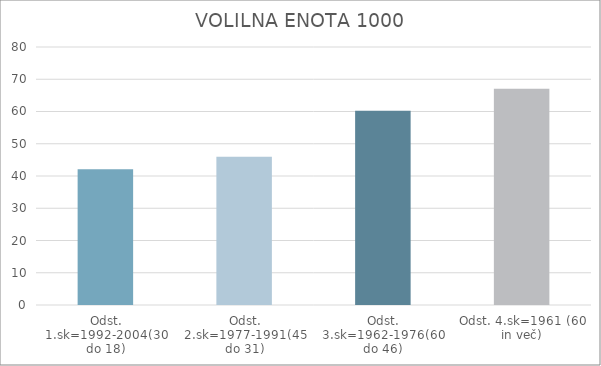
| Category | Series 0 |
|---|---|
| Odst. 1.sk=1992-2004(30 do 18) | 42.1 |
| Odst. 2.sk=1977-1991(45 do 31) | 45.95 |
| Odst. 3.sk=1962-1976(60 do 46) | 60.21 |
| Odst. 4.sk=1961 (60 in več) | 67.04 |